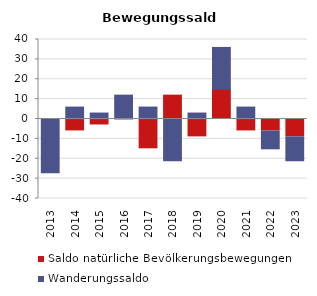
| Category | Saldo natürliche Bevölkerungsbewegungen | Wanderungssaldo |
|---|---|---|
| 2013.0 | 0 | -27 |
| 2014.0 | -6 | 6 |
| 2015.0 | -3 | 3 |
| 2016.0 | 0 | 12 |
| 2017.0 | -15 | 6 |
| 2018.0 | 12 | -21 |
| 2019.0 | -9 | 3 |
| 2020.0 | 15 | 21 |
| 2021.0 | -6 | 6 |
| 2022.0 | -6 | -9 |
| 2023.0 | -9 | -12 |